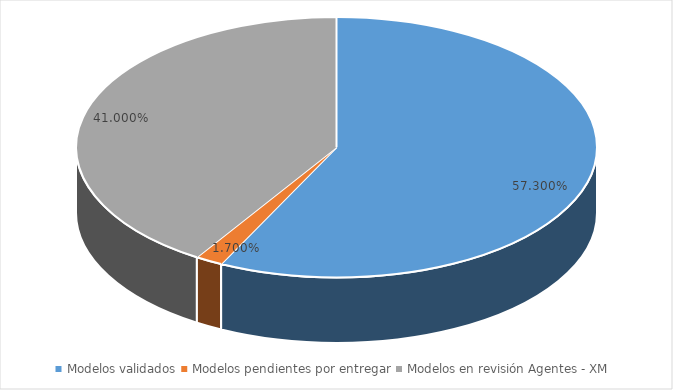
| Category | Series 0 |
|---|---|
| Modelos validados | 0.573 |
| Modelos pendientes por entregar | 0.017 |
| Modelos en revisión Agentes - XM | 0.41 |